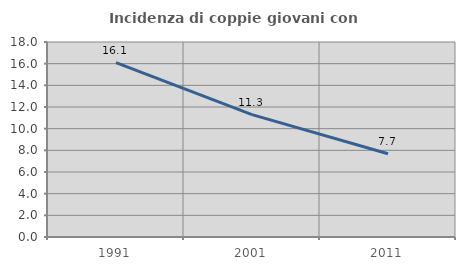
| Category | Incidenza di coppie giovani con figli |
|---|---|
| 1991.0 | 16.091 |
| 2001.0 | 11.299 |
| 2011.0 | 7.681 |